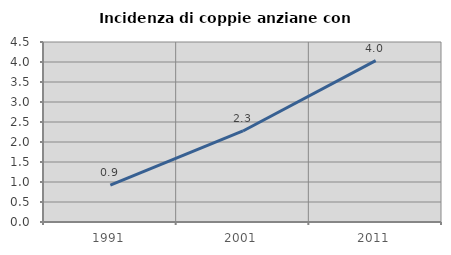
| Category | Incidenza di coppie anziane con figli |
|---|---|
| 1991.0 | 0.92 |
| 2001.0 | 2.276 |
| 2011.0 | 4.035 |